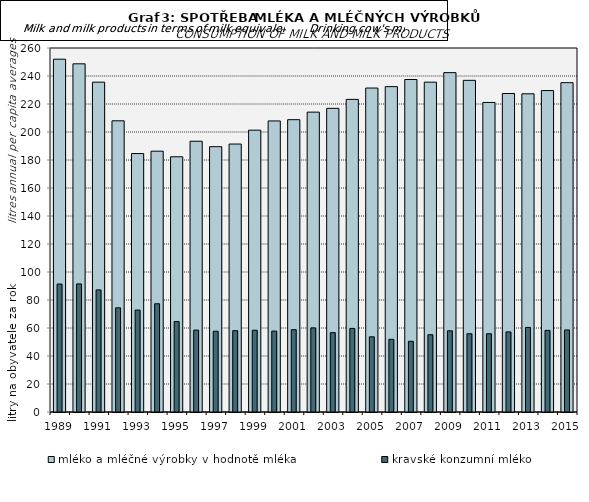
| Category | mléko a mléčné výrobky v hodnotě mléka |
|---|---|
| 1989.0 | 252 |
| 1990.0 | 248.7 |
| 1991.0 | 235.6 |
| 1992.0 | 208 |
| 1993.0 | 184.6 |
| 1994.0 | 186.3 |
| 1995.0 | 182.3 |
| 1996.0 | 193.4 |
| 1997.0 | 189.5 |
| 1998.0 | 191.4 |
| 1999.0 | 201.3 |
| 2000.0 | 207.9 |
| 2001.0 | 208.8 |
| 2002.0 | 214.2 |
| 2003.0 | 216.9 |
| 2004.0 | 223.3 |
| 2005.0 | 231.4 |
| 2006.0 | 232.4 |
| 2007.0 | 237.5 |
| 2008.0 | 235.6 |
| 2009.0 | 242.4 |
| 2010.0 | 236.9 |
| 2011.0 | 221.1 |
| 2012.0 | 227.5 |
| 2013.0 | 227.28 |
| 2014.0 | 229.6 |
| 2015.0 | 235.24 |